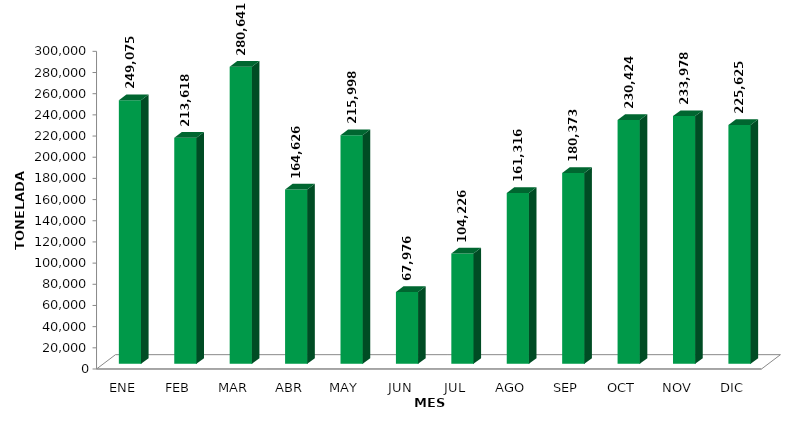
| Category | Series 0 |
|---|---|
| ENE | 249075.146 |
| FEB | 213618.443 |
| MAR | 280641.246 |
| ABR | 164626.045 |
| MAY | 215997.896 |
| JUN | 67975.886 |
| JUL | 104226.389 |
| AGO | 161316.213 |
| SEP | 180372.914 |
| OCT | 230424.454 |
| NOV | 233978.238 |
| DIC | 225625.087 |